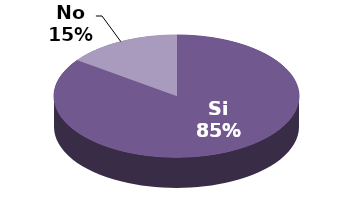
| Category | Series 1 |
|---|---|
| Si | 17 |
| No | 3 |